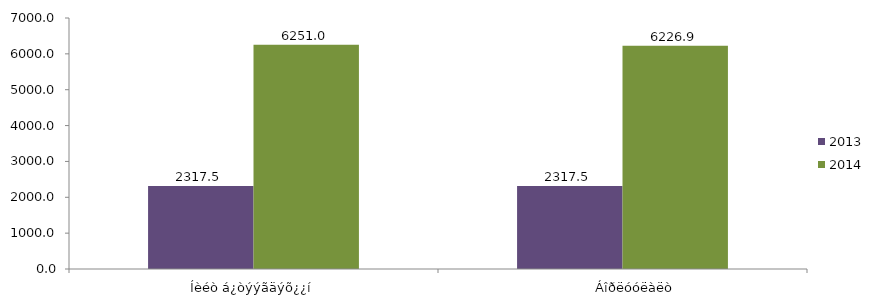
| Category | 2013 | 2014 |
|---|---|---|
| Íèéò á¿òýýãäýõ¿¿í | 2317.48 | 6250.979 |
|        Áîðëóóëàëò | 2317.48 | 6226.926 |